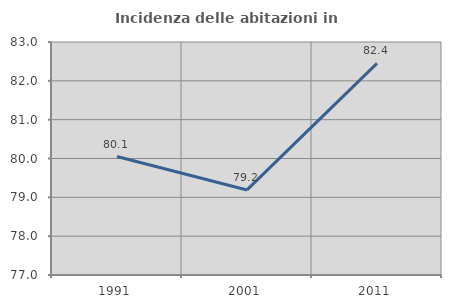
| Category | Incidenza delle abitazioni in proprietà  |
|---|---|
| 1991.0 | 80.05 |
| 2001.0 | 79.19 |
| 2011.0 | 82.449 |